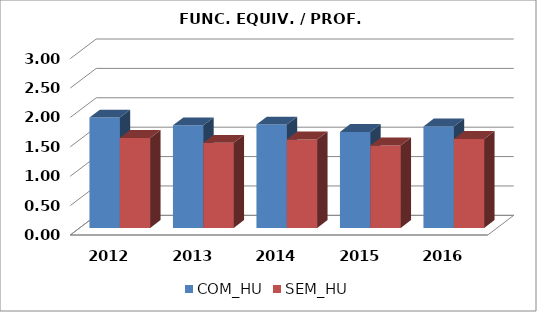
| Category | COM_HU | SEM_HU |
|---|---|---|
| 2012.0 | 1.878 | 1.531 |
| 2013.0 | 1.745 | 1.447 |
| 2014.0 | 1.759 | 1.505 |
| 2015.0 | 1.633 | 1.403 |
| 2016.0 | 1.726 | 1.515 |